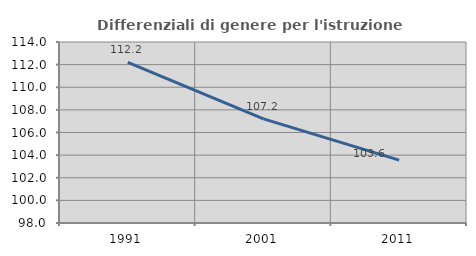
| Category | Differenziali di genere per l'istruzione superiore |
|---|---|
| 1991.0 | 112.201 |
| 2001.0 | 107.203 |
| 2011.0 | 103.553 |